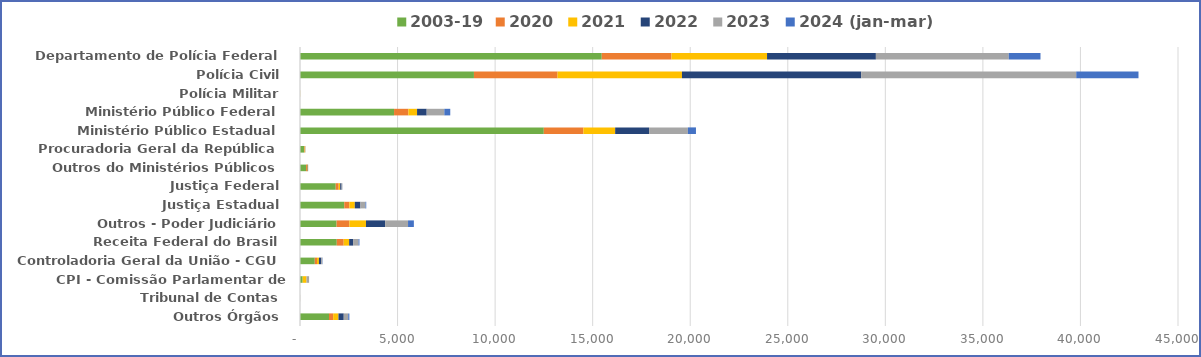
| Category | 2003-19 | 2020 | 2021 | 2022 | 2023 | 2024 (jan-mar) |
|---|---|---|---|---|---|---|
| Departamento de Polícia Federal | 15466 | 3574 | 4897 | 5579 | 6810 | 1626 |
| Polícia Civil | 8915 | 4286 | 6375 | 9189 | 11019 | 3191 |
| Polícia Militar | 0 | 0 | 7 | 1 | 0 | 0 |
| Ministério Público Federal | 4820 | 735 | 444 | 494 | 904 | 304 |
| Ministério Público Estadual | 12496 | 2028 | 1629 | 1739 | 1987 | 415 |
| Procuradoria Geral da República | 216 | 29 | 21 | 7 | 4 | 0 |
| Outros do Ministérios Públicos | 310 | 47 | 35 | 18 | 10 | 0 |
| Justiça Federal | 1831 | 152 | 76 | 71 | 39 | 4 |
| Justiça Estadual | 2268 | 261 | 280 | 287 | 259 | 40 |
| Outros - Poder Judiciário | 1875 | 658 | 848 | 982 | 1174 | 299 |
| Receita Federal do Brasil | 1885 | 354 | 280 | 203 | 276 | 49 |
| Controladoria Geral da União - CGU | 757 | 113 | 100 | 111 | 60 | 15 |
| CPI - Comissão Parlamentar de Inquérito | 137 | 0 | 197 | 0 | 132 | 0 |
| Tribunal de Contas | 2 | 1 | 0 | 0 | 3 | 0 |
| Outros Órgãos | 1486 | 214 | 272 | 270 | 228 | 61 |